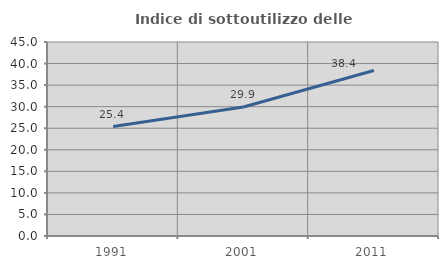
| Category | Indice di sottoutilizzo delle abitazioni  |
|---|---|
| 1991.0 | 25.387 |
| 2001.0 | 29.924 |
| 2011.0 | 38.373 |